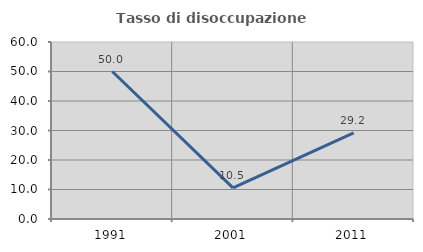
| Category | Tasso di disoccupazione giovanile  |
|---|---|
| 1991.0 | 50 |
| 2001.0 | 10.526 |
| 2011.0 | 29.167 |